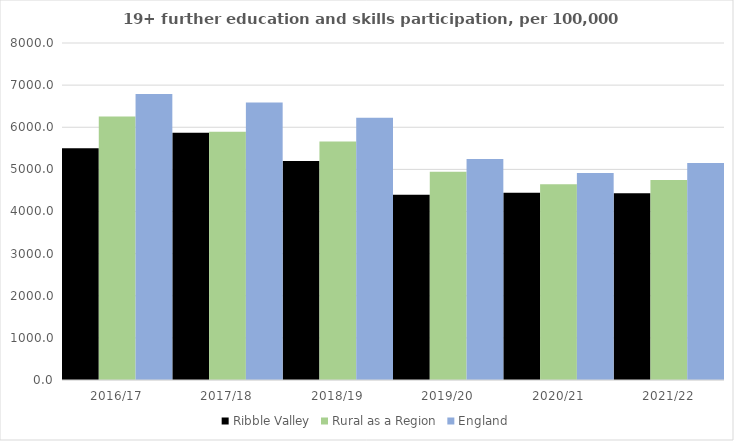
| Category | Ribble Valley | Rural as a Region | England |
|---|---|---|---|
| 2016/17 | 5503 | 6253.401 | 6788 |
| 2017/18 | 5871 | 5892.029 | 6588 |
| 2018/19 | 5201 | 5661.873 | 6227 |
| 2019/20 | 4395 | 4943.801 | 5244 |
| 2020/21 | 4443 | 4646.727 | 4913 |
| 2021/22 | 4435 | 4747.049 | 5151 |